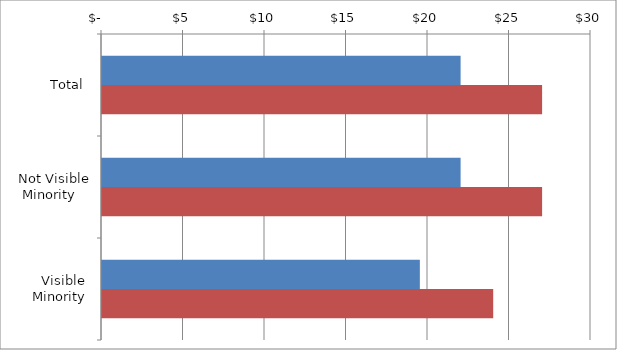
| Category | Series 0 | Series 1 |
|---|---|---|
| Total | 22 | 27 |
|  Not Visible Minority  | 22 | 27 |
|  Visible Minority  | 19.5 | 24 |